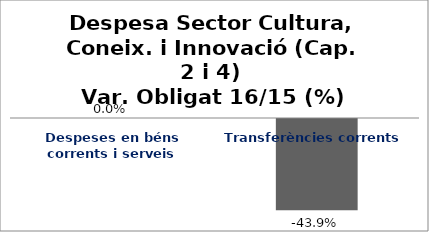
| Category | Series 0 |
|---|---|
| Despeses en béns corrents i serveis | 0 |
| Transferències corrents | -0.439 |